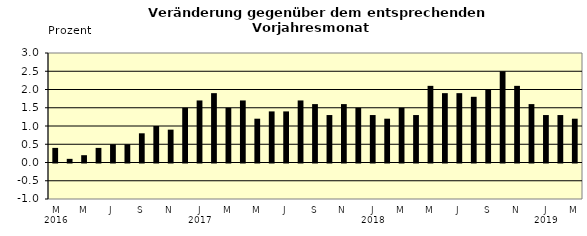
| Category | Series 0 |
|---|---|
| 0 | 0.4 |
| 1 | 0.1 |
| 2 | 0.2 |
| 3 | 0.4 |
| 4 | 0.5 |
| 5 | 0.5 |
| 6 | 0.8 |
| 7 | 1 |
| 8 | 0.9 |
| 9 | 1.5 |
| 10 | 1.7 |
| 11 | 1.9 |
| 12 | 1.5 |
| 13 | 1.7 |
| 14 | 1.2 |
| 15 | 1.4 |
| 16 | 1.4 |
| 17 | 1.7 |
| 18 | 1.6 |
| 19 | 1.3 |
| 20 | 1.6 |
| 21 | 1.5 |
| 22 | 1.3 |
| 23 | 1.2 |
| 24 | 1.5 |
| 25 | 1.3 |
| 26 | 2.1 |
| 27 | 1.9 |
| 28 | 1.9 |
| 29 | 1.8 |
| 30 | 2 |
| 31 | 2.5 |
| 32 | 2.1 |
| 33 | 1.6 |
| 34 | 1.3 |
| 35 | 1.3 |
| 36 | 1.2 |